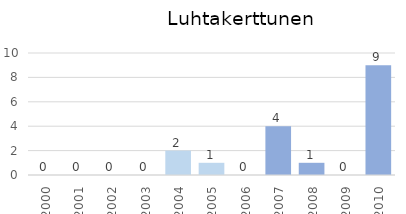
| Category | Series 0 |
|---|---|
| 2000.0 | 0 |
| 2001.0 | 0 |
| 2002.0 | 0 |
| 2003.0 | 0 |
| 2004.0 | 2 |
| 2005.0 | 1 |
| 2006.0 | 0 |
| 2007.0 | 4 |
| 2008.0 | 1 |
| 2009.0 | 0 |
| 2010.0 | 9 |